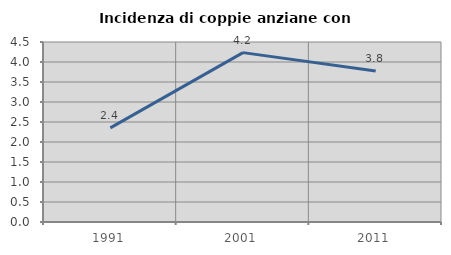
| Category | Incidenza di coppie anziane con figli |
|---|---|
| 1991.0 | 2.353 |
| 2001.0 | 4.235 |
| 2011.0 | 3.774 |